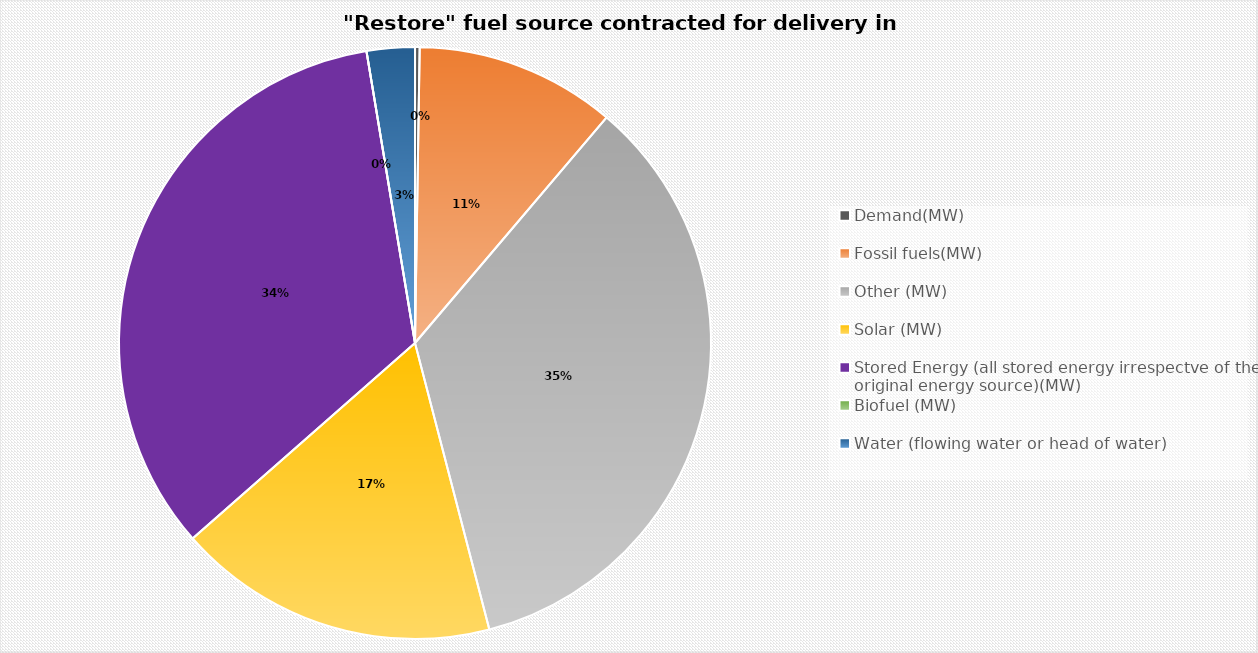
| Category | Restore fuel source procured for delivery in 22/23 |
|---|---|
| Demand(MW) | 1.15 |
| Fossil fuels(MW) | 49.9 |
| Other (MW) | 158.282 |
| Solar (MW) | 80 |
| Stored Energy (all stored energy irrespectve of the original energy source)(MW) | 154.2 |
| Biofuel (MW) | 0 |
| Water (flowing water or head of water) | 11.95 |